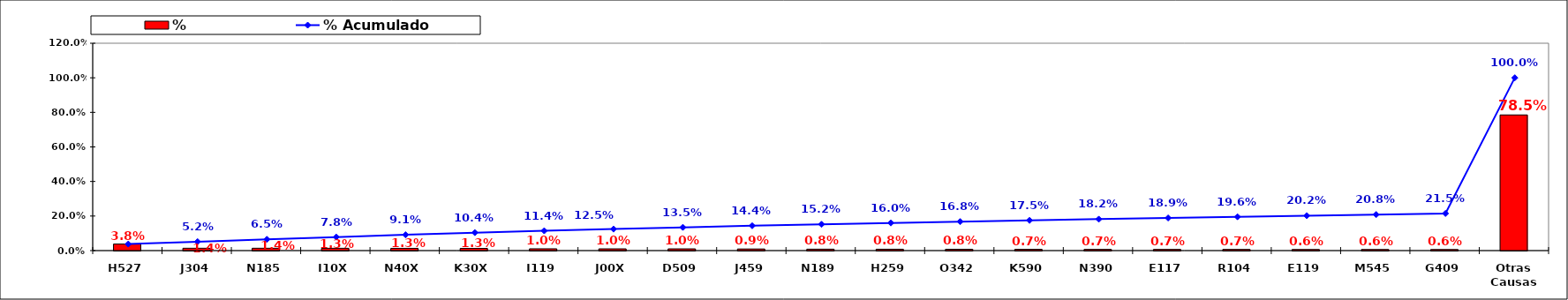
| Category | % |
|---|---|
| H527 | 0.038 |
| J304 | 0.014 |
| N185 | 0.014 |
| I10X | 0.013 |
| N40X | 0.013 |
| K30X | 0.013 |
| I119 | 0.01 |
| J00X | 0.01 |
| D509 | 0.01 |
| J459 | 0.009 |
| N189 | 0.008 |
| H259 | 0.008 |
| O342 | 0.008 |
| K590 | 0.007 |
| N390 | 0.007 |
| E117 | 0.007 |
| R104 | 0.007 |
| E119 | 0.006 |
| M545 | 0.006 |
| G409 | 0.006 |
| Otras Causas | 0.785 |